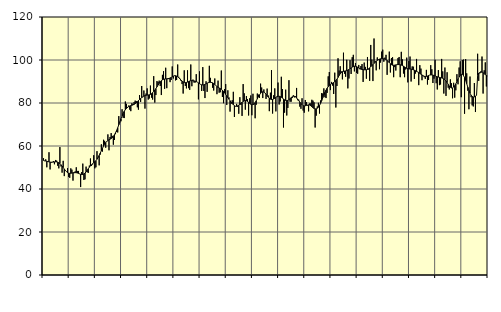
| Category | Piggar | Series 1 |
|---|---|---|
| nan | 54.3 | 53.26 |
| 87.0 | 53 | 53.09 |
| 87.0 | 53.8 | 53.01 |
| 87.0 | 50.1 | 52.89 |
| 87.0 | 52.9 | 52.76 |
| 87.0 | 57.1 | 52.63 |
| 87.0 | 49.1 | 52.5 |
| 87.0 | 52.2 | 52.46 |
| 87.0 | 52.5 | 52.45 |
| 87.0 | 53 | 52.52 |
| 87.0 | 51.5 | 52.6 |
| 87.0 | 53.5 | 52.64 |
| nan | 53.2 | 52.6 |
| 88.0 | 50.8 | 52.47 |
| 88.0 | 49.6 | 52.22 |
| 88.0 | 59.5 | 51.81 |
| 88.0 | 50.5 | 51.29 |
| 88.0 | 47.6 | 50.67 |
| 88.0 | 53.1 | 49.99 |
| 88.0 | 46 | 49.3 |
| 88.0 | 48.4 | 48.64 |
| 88.0 | 48 | 48.06 |
| 88.0 | 49.7 | 47.62 |
| 88.0 | 45.6 | 47.36 |
| nan | 45.2 | 47.28 |
| 89.0 | 49.6 | 47.31 |
| 89.0 | 49 | 47.41 |
| 89.0 | 43.9 | 47.53 |
| 89.0 | 47.4 | 47.59 |
| 89.0 | 48.2 | 47.61 |
| 89.0 | 50.1 | 47.56 |
| 89.0 | 48.4 | 47.44 |
| 89.0 | 48.4 | 47.26 |
| 89.0 | 47 | 47.05 |
| 89.0 | 40.9 | 46.85 |
| 89.0 | 47.9 | 46.74 |
| nan | 51.8 | 46.77 |
| 90.0 | 44.2 | 47.01 |
| 90.0 | 44.5 | 47.41 |
| 90.0 | 50.4 | 47.97 |
| 90.0 | 47.8 | 48.67 |
| 90.0 | 47.5 | 49.42 |
| 90.0 | 50.9 | 50.14 |
| 90.0 | 54.2 | 50.77 |
| 90.0 | 50.7 | 51.31 |
| 90.0 | 51.4 | 51.77 |
| 90.0 | 55.7 | 52.2 |
| 90.0 | 49.6 | 52.68 |
| nan | 50.1 | 53.19 |
| 91.0 | 57.6 | 53.84 |
| 91.0 | 54.5 | 54.66 |
| 91.0 | 51 | 55.62 |
| 91.0 | 56 | 56.67 |
| 91.0 | 60.8 | 57.78 |
| 91.0 | 57.4 | 58.88 |
| 91.0 | 62.9 | 59.92 |
| 91.0 | 62.4 | 60.82 |
| 91.0 | 59.2 | 61.58 |
| 91.0 | 62.3 | 62.16 |
| 91.0 | 65.4 | 62.57 |
| nan | 58 | 62.9 |
| 92.0 | 64.2 | 63.17 |
| 92.0 | 66 | 63.46 |
| 92.0 | 64.7 | 63.89 |
| 92.0 | 60.6 | 64.49 |
| 92.0 | 62.8 | 65.25 |
| 92.0 | 65.5 | 66.16 |
| 92.0 | 66.5 | 67.25 |
| 92.0 | 66.3 | 68.48 |
| 92.0 | 73.9 | 69.85 |
| 92.0 | 71 | 71.29 |
| 92.0 | 71.5 | 72.71 |
| nan | 77.1 | 74.04 |
| 93.0 | 73.1 | 75.21 |
| 93.0 | 73 | 76.16 |
| 93.0 | 80.7 | 76.9 |
| 93.0 | 79.6 | 77.5 |
| 93.0 | 77.7 | 77.97 |
| 93.0 | 78.8 | 78.34 |
| 93.0 | 76.9 | 78.61 |
| 93.0 | 76.2 | 78.8 |
| 93.0 | 79.9 | 78.95 |
| 93.0 | 79.5 | 79.11 |
| 93.0 | 80.4 | 79.36 |
| nan | 81.1 | 79.69 |
| 94.0 | 80.9 | 80.11 |
| 94.0 | 78 | 80.61 |
| 94.0 | 76.9 | 81.13 |
| 94.0 | 83.7 | 81.62 |
| 94.0 | 80.5 | 82.1 |
| 94.0 | 87.9 | 82.51 |
| 94.0 | 82.7 | 82.87 |
| 94.0 | 85.8 | 83.19 |
| 94.0 | 77.4 | 83.45 |
| 94.0 | 84.4 | 83.61 |
| 94.0 | 86.8 | 83.68 |
| nan | 81.6 | 83.73 |
| 95.0 | 82.1 | 83.83 |
| 95.0 | 88.1 | 84.02 |
| 95.0 | 82.5 | 84.33 |
| 95.0 | 81.6 | 84.78 |
| 95.0 | 92.5 | 85.33 |
| 95.0 | 80.2 | 85.98 |
| 95.0 | 83.7 | 86.71 |
| 95.0 | 90.2 | 87.5 |
| 95.0 | 89.8 | 88.33 |
| 95.0 | 90.4 | 89.15 |
| 95.0 | 87.9 | 89.84 |
| nan | 83.7 | 90.38 |
| 96.0 | 93.1 | 90.77 |
| 96.0 | 94.8 | 91.02 |
| 96.0 | 86.6 | 91.16 |
| 96.0 | 96.4 | 91.23 |
| 96.0 | 86.9 | 91.26 |
| 96.0 | 91.5 | 91.3 |
| 96.0 | 91.1 | 91.42 |
| 96.0 | 89.7 | 91.62 |
| 96.0 | 90.7 | 91.9 |
| 96.0 | 97 | 92.2 |
| 96.0 | 91.4 | 92.46 |
| nan | 92.8 | 92.66 |
| 97.0 | 90.5 | 92.69 |
| 97.0 | 90.7 | 92.52 |
| 97.0 | 97.9 | 92.21 |
| 97.0 | 92.2 | 91.76 |
| 97.0 | 91.4 | 91.21 |
| 97.0 | 90.3 | 90.67 |
| 97.0 | 88.8 | 90.19 |
| 97.0 | 84.4 | 89.83 |
| 97.0 | 95.2 | 89.6 |
| 97.0 | 87.9 | 89.5 |
| 97.0 | 86.8 | 89.55 |
| nan | 95.2 | 89.73 |
| 98.0 | 86.9 | 89.97 |
| 98.0 | 86.1 | 90.23 |
| 98.0 | 97.9 | 90.39 |
| 98.0 | 87.8 | 90.41 |
| 98.0 | 90.9 | 90.37 |
| 98.0 | 89.5 | 90.28 |
| 98.0 | 89.5 | 90.14 |
| 98.0 | 93.4 | 89.98 |
| 98.0 | 89.7 | 89.72 |
| 98.0 | 81.7 | 89.36 |
| 98.0 | 94.7 | 88.99 |
| nan | 88.6 | 88.66 |
| 99.0 | 85.6 | 88.45 |
| 99.0 | 96.7 | 88.39 |
| 99.0 | 85.6 | 88.46 |
| 99.0 | 82.3 | 88.63 |
| 99.0 | 90.1 | 88.88 |
| 99.0 | 85.2 | 89.17 |
| 99.0 | 89.3 | 89.44 |
| 99.0 | 97.3 | 89.59 |
| 99.0 | 91.7 | 89.61 |
| 99.0 | 89.3 | 89.54 |
| 99.0 | 87.1 | 89.37 |
| nan | 85.8 | 89.04 |
| 0.0 | 91.4 | 88.63 |
| 0.0 | 88.2 | 88.16 |
| 0.0 | 84.1 | 87.67 |
| 0.0 | 90.4 | 87.28 |
| 0.0 | 84.8 | 86.99 |
| 0.0 | 85 | 86.72 |
| 0.0 | 95.1 | 86.39 |
| 0.0 | 82.8 | 85.95 |
| 0.0 | 79.9 | 85.38 |
| 0.0 | 86.5 | 84.73 |
| 0.0 | 88.8 | 84.01 |
| nan | 79.1 | 83.28 |
| 1.0 | 85.9 | 82.53 |
| 1.0 | 82.6 | 81.76 |
| 1.0 | 76 | 81.05 |
| 1.0 | 79.7 | 80.38 |
| 1.0 | 81.3 | 79.73 |
| 1.0 | 85.2 | 79.19 |
| 1.0 | 73.5 | 78.76 |
| 1.0 | 78.6 | 78.49 |
| 1.0 | 79.6 | 78.48 |
| 1.0 | 78.2 | 78.69 |
| 1.0 | 75 | 79.01 |
| nan | 82.7 | 79.43 |
| 2.0 | 79.1 | 79.89 |
| 2.0 | 74 | 80.32 |
| 2.0 | 88.8 | 80.7 |
| 2.0 | 84.5 | 81.01 |
| 2.0 | 76.9 | 81.13 |
| 2.0 | 83.2 | 81.02 |
| 2.0 | 81.8 | 80.72 |
| 2.0 | 74.2 | 80.3 |
| 2.0 | 82.2 | 79.83 |
| 2.0 | 83.5 | 79.42 |
| 2.0 | 74.3 | 79.2 |
| nan | 84.3 | 79.25 |
| 3.0 | 79.3 | 79.59 |
| 3.0 | 72.9 | 80.21 |
| 3.0 | 79.2 | 81.02 |
| 3.0 | 84.4 | 81.94 |
| 3.0 | 83.9 | 82.9 |
| 3.0 | 82.4 | 83.78 |
| 3.0 | 89 | 84.52 |
| 3.0 | 87.2 | 85.02 |
| 3.0 | 82.3 | 85.21 |
| 3.0 | 86.3 | 85.08 |
| 3.0 | 84.7 | 84.68 |
| nan | 81.9 | 84.08 |
| 4.0 | 86.7 | 83.38 |
| 4.0 | 83.5 | 82.74 |
| 4.0 | 76.2 | 82.22 |
| 4.0 | 84.8 | 81.8 |
| 4.0 | 95.3 | 81.61 |
| 4.0 | 75.1 | 81.65 |
| 4.0 | 83.6 | 81.86 |
| 4.0 | 86.8 | 82.18 |
| 4.0 | 76.1 | 82.58 |
| 4.0 | 82.7 | 82.93 |
| 4.0 | 89.5 | 83.12 |
| nan | 79.3 | 83.15 |
| 5.0 | 80.7 | 82.99 |
| 5.0 | 92.2 | 82.68 |
| 5.0 | 86.5 | 82.28 |
| 5.0 | 68.6 | 81.88 |
| 5.0 | 75.5 | 81.49 |
| 5.0 | 86.2 | 81.22 |
| 5.0 | 74.2 | 81.13 |
| 5.0 | 77.7 | 81.23 |
| 5.0 | 90.6 | 81.54 |
| 5.0 | 80.6 | 81.99 |
| 5.0 | 80.6 | 82.46 |
| nan | 82.3 | 82.87 |
| 6.0 | 83.6 | 83.12 |
| 6.0 | 82.6 | 83.11 |
| 6.0 | 83.1 | 82.82 |
| 6.0 | 87 | 82.35 |
| 6.0 | 81.3 | 81.78 |
| 6.0 | 81.5 | 81.1 |
| 6.0 | 78.3 | 80.4 |
| 6.0 | 77.3 | 79.75 |
| 6.0 | 82.2 | 79.18 |
| 6.0 | 76.5 | 78.78 |
| 6.0 | 75.5 | 78.65 |
| nan | 81.4 | 78.72 |
| 7.0 | 80.4 | 78.89 |
| 7.0 | 78.8 | 79.07 |
| 7.0 | 76.1 | 79.15 |
| 7.0 | 79.8 | 79.05 |
| 7.0 | 79.8 | 78.74 |
| 7.0 | 81.5 | 78.3 |
| 7.0 | 81.1 | 77.83 |
| 7.0 | 80.3 | 77.45 |
| 7.0 | 68.6 | 77.25 |
| 7.0 | 74.1 | 77.27 |
| 7.0 | 78.4 | 77.53 |
| nan | 80.1 | 78.04 |
| 8.0 | 75.1 | 78.81 |
| 8.0 | 81.2 | 79.83 |
| 8.0 | 84.6 | 81.07 |
| 8.0 | 84.4 | 82.43 |
| 8.0 | 86.8 | 83.75 |
| 8.0 | 82.7 | 84.96 |
| 8.0 | 82.3 | 86 |
| 8.0 | 84.7 | 86.87 |
| 8.0 | 92.4 | 87.58 |
| 8.0 | 94.4 | 88.16 |
| 8.0 | 86 | 88.62 |
| nan | 89.8 | 88.95 |
| 9.0 | 88.1 | 89.23 |
| 9.0 | 84.2 | 89.55 |
| 9.0 | 94.1 | 89.91 |
| 9.0 | 77.9 | 90.4 |
| 9.0 | 87.9 | 91.08 |
| 9.0 | 100.8 | 91.9 |
| 9.0 | 95.1 | 92.79 |
| 9.0 | 97.1 | 93.6 |
| 9.0 | 94.7 | 94.21 |
| 9.0 | 91 | 94.57 |
| 9.0 | 103.4 | 94.74 |
| nan | 93.6 | 94.84 |
| 10.0 | 92.2 | 94.93 |
| 10.0 | 100.1 | 95.08 |
| 10.0 | 86.8 | 95.31 |
| 10.0 | 91.4 | 95.59 |
| 10.0 | 99.9 | 95.92 |
| 10.0 | 93.5 | 96.32 |
| 10.0 | 101.3 | 96.69 |
| 10.0 | 102.4 | 96.97 |
| 10.0 | 94.7 | 97.12 |
| 10.0 | 98.6 | 97.1 |
| 10.0 | 94 | 96.91 |
| nan | 93.6 | 96.6 |
| 11.0 | 97.7 | 96.28 |
| 11.0 | 95.7 | 95.97 |
| 11.0 | 97.2 | 95.76 |
| 11.0 | 98.1 | 95.62 |
| 11.0 | 89.8 | 95.51 |
| 11.0 | 98.8 | 95.45 |
| 11.0 | 96.8 | 95.43 |
| 11.0 | 91.3 | 95.47 |
| 11.0 | 101.4 | 95.62 |
| 11.0 | 95.6 | 95.92 |
| 11.0 | 90.3 | 96.35 |
| nan | 107 | 96.84 |
| 12.0 | 100.2 | 97.38 |
| 12.0 | 90.2 | 97.91 |
| 12.0 | 110 | 98.41 |
| 12.0 | 99.5 | 98.91 |
| 12.0 | 95.2 | 99.4 |
| 12.0 | 101.2 | 99.83 |
| 12.0 | 100.3 | 100.17 |
| 12.0 | 95.7 | 100.42 |
| 12.0 | 98.8 | 100.55 |
| 12.0 | 103.9 | 100.59 |
| 12.0 | 104.8 | 100.6 |
| nan | 99.2 | 100.58 |
| 13.0 | 101.1 | 100.47 |
| 13.0 | 102.4 | 100.22 |
| 13.0 | 93.1 | 99.83 |
| 13.0 | 99.2 | 99.3 |
| 13.0 | 103.9 | 98.75 |
| 13.0 | 94.2 | 98.24 |
| 13.0 | 100.9 | 97.82 |
| 13.0 | 101.3 | 97.59 |
| 13.0 | 92 | 97.55 |
| 13.0 | 96.7 | 97.61 |
| 13.0 | 95.1 | 97.73 |
| nan | 97.8 | 97.83 |
| 14.0 | 100.9 | 97.88 |
| 14.0 | 101.4 | 97.87 |
| 14.0 | 92 | 97.79 |
| 14.0 | 103.8 | 97.63 |
| 14.0 | 100.3 | 97.4 |
| 14.0 | 93.7 | 97.12 |
| 14.0 | 92 | 96.79 |
| 14.0 | 95.6 | 96.45 |
| 14.0 | 101.1 | 96.17 |
| 14.0 | 89.6 | 95.99 |
| 14.0 | 99.5 | 95.87 |
| nan | 101.6 | 95.8 |
| 15.0 | 90 | 95.72 |
| 15.0 | 97 | 95.61 |
| 15.0 | 96.9 | 95.46 |
| 15.0 | 91.2 | 95.26 |
| 15.0 | 93.7 | 95 |
| 15.0 | 100.5 | 94.71 |
| 15.0 | 94.5 | 94.45 |
| 15.0 | 88.3 | 94.15 |
| 15.0 | 97.6 | 93.78 |
| 15.0 | 96 | 93.39 |
| 15.0 | 90.6 | 93.05 |
| nan | 92.8 | 92.7 |
| 16.0 | 92 | 92.44 |
| 16.0 | 91.2 | 92.34 |
| 16.0 | 95.4 | 92.38 |
| 16.0 | 88.6 | 92.53 |
| 16.0 | 90.7 | 92.78 |
| 16.0 | 93 | 92.98 |
| 16.0 | 97.6 | 93.05 |
| 16.0 | 95.7 | 93.06 |
| 16.0 | 89.3 | 92.96 |
| 16.0 | 91.3 | 92.8 |
| 16.0 | 100.1 | 92.59 |
| nan | 89.2 | 92.38 |
| 17.0 | 86.3 | 92.2 |
| 17.0 | 95.3 | 92.05 |
| 17.0 | 88.3 | 91.91 |
| 17.0 | 88.6 | 91.79 |
| 17.0 | 100.5 | 91.67 |
| 17.0 | 94.7 | 91.51 |
| 17.0 | 84.4 | 91.24 |
| 17.0 | 96.5 | 90.81 |
| 17.0 | 83.3 | 90.22 |
| 17.0 | 94.3 | 89.51 |
| 17.0 | 87.1 | 88.68 |
| nan | 86.3 | 87.9 |
| 18.0 | 91 | 87.31 |
| 18.0 | 89.2 | 86.97 |
| 18.0 | 82.2 | 87 |
| 18.0 | 89.4 | 87.4 |
| 18.0 | 82.5 | 88.06 |
| 18.0 | 85.9 | 88.91 |
| 18.0 | 93.4 | 89.97 |
| 18.0 | 88.7 | 91.09 |
| 18.0 | 96.5 | 92.09 |
| 18.0 | 99.4 | 92.87 |
| 18.0 | 82.7 | 93.31 |
| nan | 100 | 93.28 |
| 19.0 | 100.2 | 92.79 |
| 19.0 | 75 | 91.85 |
| 19.0 | 100.4 | 90.52 |
| 19.0 | 93.8 | 88.97 |
| 19.0 | 85.7 | 87.36 |
| 19.0 | 77.1 | 85.88 |
| 19.0 | 92.3 | 84.6 |
| 19.0 | 82.7 | 83.63 |
| 19.0 | 78.9 | 83.04 |
| 19.0 | 78.4 | 82.78 |
| 19.0 | 89.3 | 82.84 |
| nan | 75.8 | 83.18 |
| 20.0 | 83.7 | 83.61 |
| 20.0 | 102.9 | 92.86 |
| 20.0 | 90.3 | 93.94 |
| 20.0 | 93.8 | 94.13 |
| 20.0 | 94 | 94.59 |
| 20.0 | 101.6 | 94.42 |
| 20.0 | 84.4 | 94.09 |
| 20.0 | 95.2 | 93.64 |
| 20.0 | 98.9 | 93.19 |
| 20.0 | 87.7 | 92.81 |
| 20.0 | 92.6 | 92.51 |